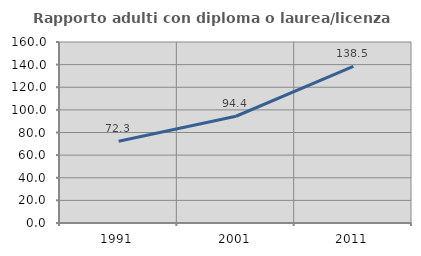
| Category | Rapporto adulti con diploma o laurea/licenza media  |
|---|---|
| 1991.0 | 72.312 |
| 2001.0 | 94.361 |
| 2011.0 | 138.477 |